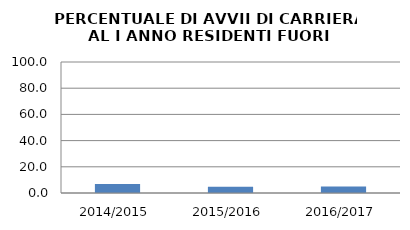
| Category | 2014/2015 2015/2016 2016/2017 |
|---|---|
| 2014/2015 | 6.78 |
| 2015/2016 | 4.808 |
| 2016/2017 | 4.886 |